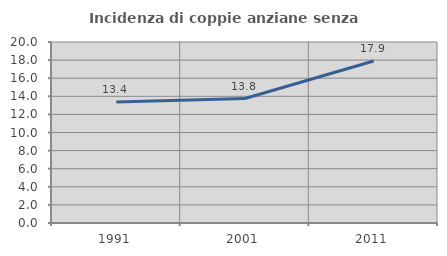
| Category | Incidenza di coppie anziane senza figli  |
|---|---|
| 1991.0 | 13.371 |
| 2001.0 | 13.75 |
| 2011.0 | 17.907 |